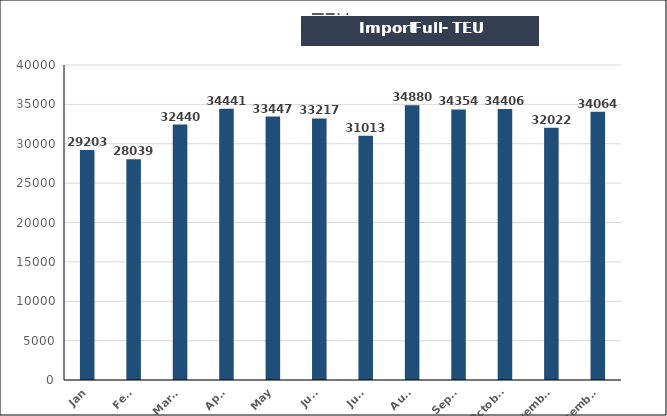
| Category | TEU |
|---|---|
| Jan | 29203 |
| Feb. | 28039 |
| March | 32440 |
| April | 34441 |
| May | 33447 |
| June | 33217 |
| July | 31013 |
| Aug. | 34880 |
| Sept. | 34354 |
| October | 34406 |
| November | 32022 |
| December | 34064 |